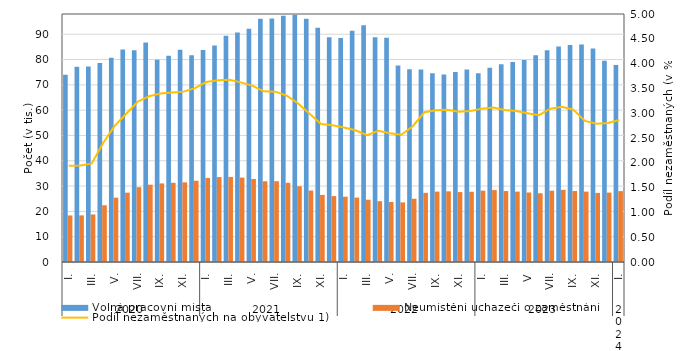
| Category | Volná pracovní místa | Neumístění uchazeči o zaměstnání |
|---|---|---|
| 0 | 73987 | 18390 |
| 1 | 77123 | 18423 |
| 2 | 77251 | 18788 |
| 3 | 78679 | 22421 |
| 4 | 80742 | 25424 |
| 5 | 83969 | 27405 |
| 6 | 83672 | 29567 |
| 7 | 86744 | 30556 |
| 8 | 79961 | 31056 |
| 9 | 81479 | 31302 |
| 10 | 83826 | 31473 |
| 11 | 81719 | 32107 |
| 12 | 83735 | 33217 |
| 13 | 85524 | 33565 |
| 14 | 89385 | 33612 |
| 15 | 90690 | 33352 |
| 16 | 92204 | 32808 |
| 17 | 96081 | 31905 |
| 18 | 96249 | 31917 |
| 19 | 97288 | 31271 |
| 20 | 97734 | 29926 |
| 21 | 96137 | 28242 |
| 22 | 92587 | 26521 |
| 23 | 88785 | 26047 |
| 24 | 88536 | 25817 |
| 25 | 91403 | 25444 |
| 26 | 93541 | 24612 |
| 27 | 88791 | 24028 |
| 28 | 88625 | 23728 |
| 29 | 77627 | 23550 |
| 30 | 76207 | 24989 |
| 31 | 76110 | 27326 |
| 32 | 74541 | 27809 |
| 33 | 74117 | 27914 |
| 34 | 75125 | 27625 |
| 35 | 76045 | 27766 |
| 36 | 74577 | 28199 |
| 37 | 76736 | 28419 |
| 38 | 78112 | 28041 |
| 39 | 79054 | 27810 |
| 40 | 79846 | 27469 |
| 41 | 81683 | 27164 |
| 42 | 83644 | 28176 |
| 43 | 85142 | 28501 |
| 44 | 85733 | 28039 |
| 45 | 85989 | 27808 |
| 46 | 84332 | 27298 |
| 47 | 79569 | 27425 |
| 48 | 77837 | 28013 |